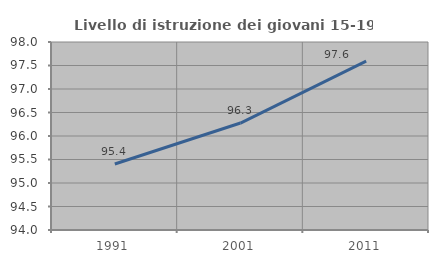
| Category | Livello di istruzione dei giovani 15-19 anni |
|---|---|
| 1991.0 | 95.404 |
| 2001.0 | 96.276 |
| 2011.0 | 97.592 |